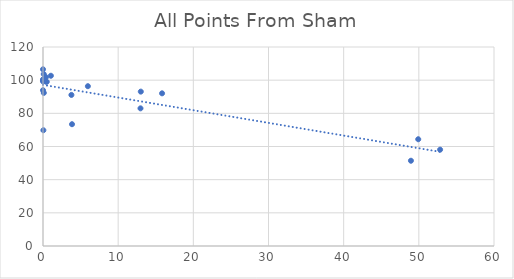
| Category | All Points From Sham |
|---|---|
| 48.95 | 51.416 |
| 13.01 | 93.089 |
| 3.78 | 91.1 |
| 0.39 | 101.794 |
| 0.1 | 100.011 |
| 0.04 | 100.62 |
| 0.0 | 100 |
| 0.0 | 99.266 |
| 52.83 | 58.086 |
| 12.97 | 83.005 |
| 3.86 | 73.437 |
| 0.5 | 99.026 |
| 0.11 | 92.327 |
| 0.05 | 69.797 |
| 0.0 | 100 |
| 0.0 | 93.933 |
| 49.92 | 64.378 |
| 15.84 | 92.067 |
| 5.97 | 96.365 |
| 1.05 | 102.662 |
| 0.36 | 99.209 |
| 0.1 | 103.663 |
| 0.0 | 100 |
| 0.0 | 106.558 |